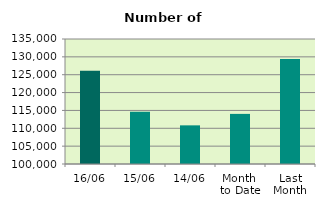
| Category | Series 0 |
|---|---|
| 16/06 | 126078 |
| 15/06 | 114626 |
| 14/06 | 110822 |
| Month 
to Date | 114031.667 |
| Last
Month | 129378.19 |